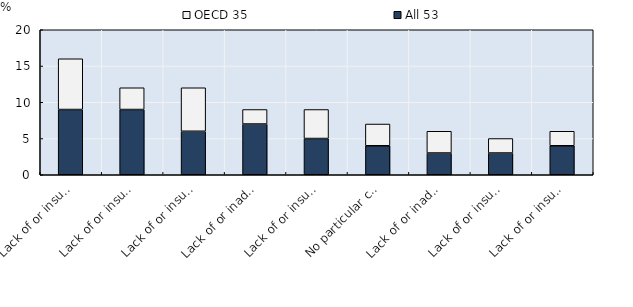
| Category | All 53 | OECD 35 |
|---|---|---|
| Lack of or insufficient mandate for the coordinating institution | 9 | 7 |
| Lack of or insufficient financial resources for the coordinating institution | 9 | 3 |
| Lack of or insufficient incentives among government institutions to coordinate | 6 | 6 |
| Lack of or inadequate institutional mechanisms to collaborate with NGOs and private sector | 7 | 2 |
| Lack of or insufficient human resources for the coordinating institution | 5 | 4 |
| No particular challenges in coordinating open government policies and initiatives | 4 | 3 |
| Lack of or inadequate strategy for the coordinating institution | 3 | 3 |
| Lack of or insufficient capacities in the coordinating institution | 3 | 2 |
| Lack of or insufficient political will/ leadership  | 4 | 2 |